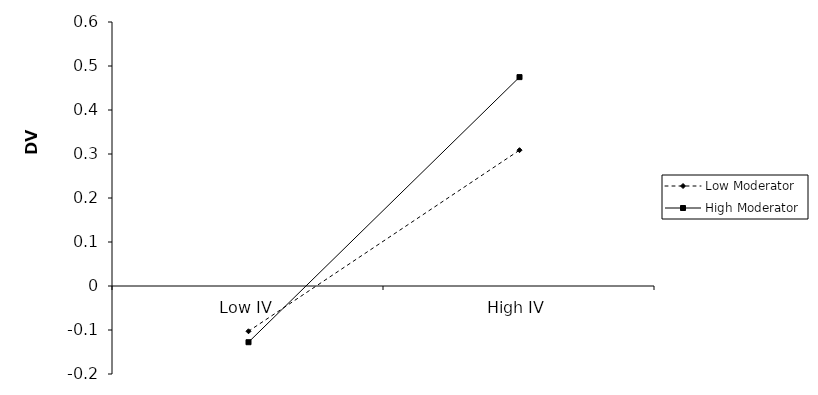
| Category | Low Moderator | High Moderator |
|---|---|---|
| Low IV | -0.103 | -0.128 |
| High IV | 0.309 | 0.475 |